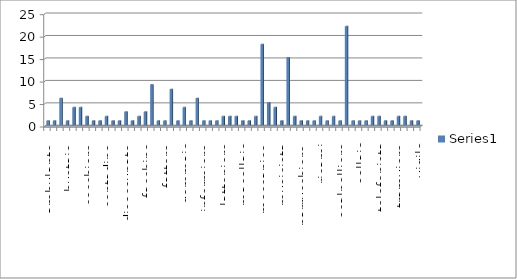
| Category | Series 0 |
|---|---|
| ambulante | 1 |
| artigiano | 1 |
| autista | 6 |
| bustaio | 1 |
| calzolaio | 4 |
| cameriere | 4 |
| cocchiere | 2 |
| cocchino | 1 |
| commesso | 1 |
| contadino | 2 |
| cuoco | 1 |
| custode | 1 |
| disoccupato | 3 |
| esercente | 1 |
| fabbri | 2 |
| facchino | 3 |
| falegname  | 9 |
| farmacista | 1 |
| fattore | 1 |
| fattorino | 8 |
| fotoincisore | 1 |
| gommaio | 4 |
| idraulico | 1 |
| impiegato | 6 |
| infermiere | 1 |
| inserviente | 1 |
| lattaio | 1 |
| lattoniere | 2 |
| lavandaio | 2 |
| litografo | 2 |
| macellaio | 1 |
| maestro di musica | 1 |
| materassaio | 2 |
| meccanico | 18 |
| militare | 5 |
| muratore | 4 |
| musicista | 1 |
| operaio | 15 |
| orefice | 2 |
| parrucchiere | 1 |
| ragioniere | 1 |
| restoratore  | 1 |
| ricami | 2 |
| rilegatore | 1 |
| sarto | 2 |
| scalpelliere | 1 |
| scolaro | 22 |
| scultore | 1 |
| sellaio | 1 |
| stuccatore | 1 |
| tappezziere | 2 |
| telefonista | 2 |
| tipografo | 1 |
| tornitore | 1 |
| tramviere | 2 |
| verniciatore | 2 |
| vigilante | 1 |
| vigile | 1 |